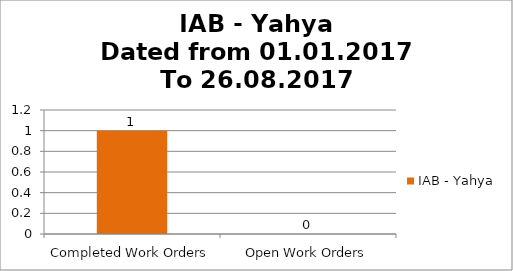
| Category | IAB - Yahya |
|---|---|
| Completed Work Orders | 1 |
| Open Work Orders | 0 |